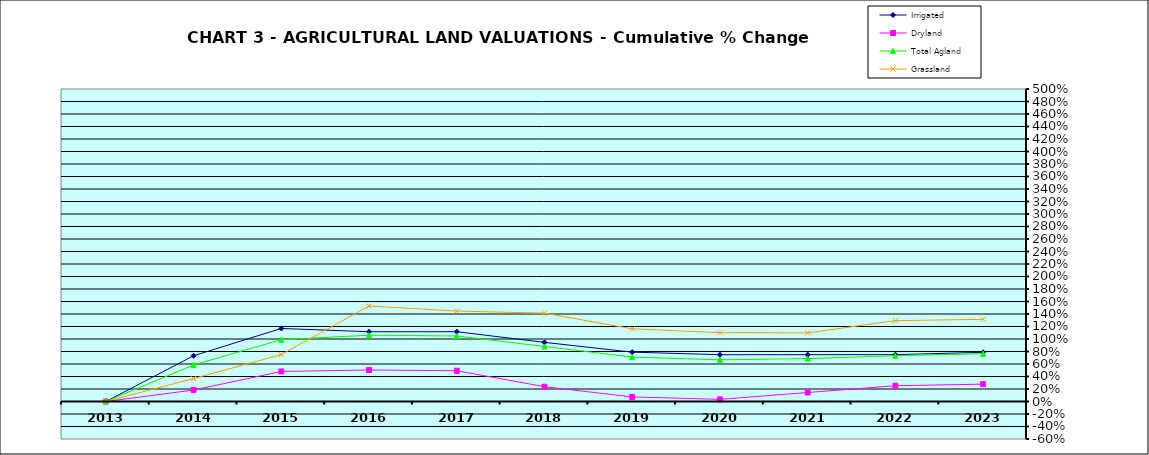
| Category | Irrigated | Dryland | Total Agland | Grassland |
|---|---|---|---|---|
| 2013.0 | 0 | 0 | 0 | 0 |
| 2014.0 | 0.732 | 0.183 | 0.585 | 0.367 |
| 2015.0 | 1.169 | 0.481 | 0.989 | 0.751 |
| 2016.0 | 1.116 | 0.504 | 1.061 | 1.528 |
| 2017.0 | 1.117 | 0.492 | 1.048 | 1.447 |
| 2018.0 | 0.946 | 0.237 | 0.881 | 1.413 |
| 2019.0 | 0.79 | 0.073 | 0.71 | 1.163 |
| 2020.0 | 0.748 | 0.034 | 0.667 | 1.101 |
| 2021.0 | 0.749 | 0.144 | 0.687 | 1.097 |
| 2022.0 | 0.75 | 0.252 | 0.733 | 1.294 |
| 2023.0 | 0.787 | 0.278 | 0.766 | 1.315 |